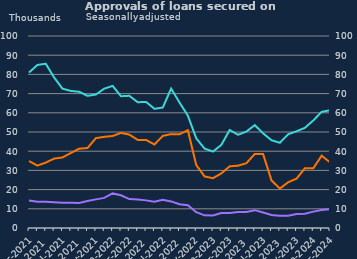
| Category | Remortgaging | Other |
|---|---|---|
| Mar-2021 | 34889 | 14318 |
| Apr-2021 | 32506 | 13735 |
| May-2021 | 34041 | 13632 |
| Jun-2021 | 36158 | 13457 |
| Jul-2021 | 36738 | 13172 |
| Aug-2021 | 39050 | 13159 |
| Sep-2021 | 41330 | 13043 |
| Oct-2021 | 41657 | 14091 |
| Nov-2021 | 46817 | 14914 |
| Dec-2021 | 47472 | 15690 |
| Jan-2022 | 47912 | 18010 |
| Feb-2022 | 49519 | 17037 |
| Mar-2022 | 48636 | 15061 |
| Apr-2022 | 45892 | 14858 |
| May-2022 | 45866 | 14388 |
| Jun-2022 | 43496 | 13674 |
| Jul-2022 | 47979 | 14700 |
| Aug-2022 | 48895 | 13848 |
| Sep-2022 | 48831 | 12350 |
| Oct-2022 | 50916 | 11846 |
| Nov-2022 | 32821 | 8243 |
| Dec-2022 | 26846 | 6581 |
| Jan-2023 | 25949 | 6530 |
| Feb-2023 | 28427 | 7788 |
| Mar-2023 | 32116 | 7851 |
| Apr-2023 | 32450 | 8380 |
| May-2023 | 33748 | 8285 |
| Jun-2023 | 38539 | 9292 |
| Jul-2023 | 38504 | 8072 |
| Aug-2023 | 24792 | 6808 |
| Sep-2023 | 20540 | 6395 |
| Oct-2023 | 23844 | 6339 |
| Nov-2023 | 25724 | 7322 |
| Dec-2023 | 31131 | 7392 |
| Jan-2024 | 31085 | 8535 |
| Feb-2024 | 37674 | 9423 |
| Mar-2024 | 34170 | 9855 |